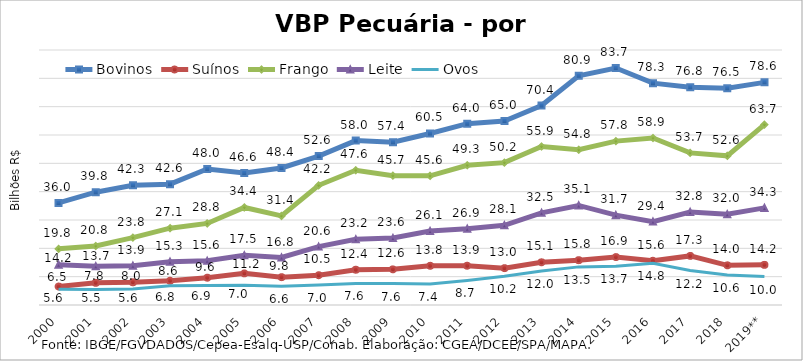
| Category | Bovinos | Suínos | Frango | Leite | Ovos |
|---|---|---|---|---|---|
| 2000 | 36.019 | 6.522 | 19.82 | 14.227 | 5.563 |
| 2001 | 39.816 | 7.824 | 20.832 | 13.691 | 5.482 |
| 2002 | 42.252 | 8.019 | 23.779 | 13.863 | 5.648 |
| 2003 | 42.644 | 8.571 | 27.11 | 15.266 | 6.831 |
| 2004 | 47.979 | 9.636 | 28.788 | 15.603 | 6.924 |
| 2005 | 46.581 | 11.172 | 34.417 | 17.549 | 6.971 |
| 2006 | 48.363 | 9.828 | 31.442 | 16.762 | 6.622 |
| 2007 | 52.559 | 10.509 | 42.245 | 20.606 | 7.037 |
| 2008 | 58.031 | 12.443 | 47.554 | 23.181 | 7.6 |
| 2009 | 57.426 | 12.578 | 45.659 | 23.633 | 7.578 |
| 2010 | 60.544 | 13.837 | 45.604 | 26.099 | 7.37 |
| 2011 | 64.005 | 13.859 | 49.323 | 26.905 | 8.685 |
| 2012 | 64.959 | 13.013 | 50.243 | 28.115 | 10.181 |
| 2013 | 70.392 | 15.067 | 55.921 | 32.535 | 11.974 |
| 2014 | 80.868 | 15.825 | 54.79 | 35.133 | 13.453 |
| 2015 | 83.651 | 16.912 | 57.842 | 31.714 | 13.698 |
| 2016 | 78.301 | 15.608 | 58.937 | 29.427 | 14.768 |
| 2017 | 76.839 | 17.326 | 53.681 | 32.787 | 12.172 |
| 2018 | 76.507 | 14.003 | 52.647 | 32.031 | 10.61 |
| 2019** | 78.583 | 14.17 | 63.662 | 34.27 | 10.024 |